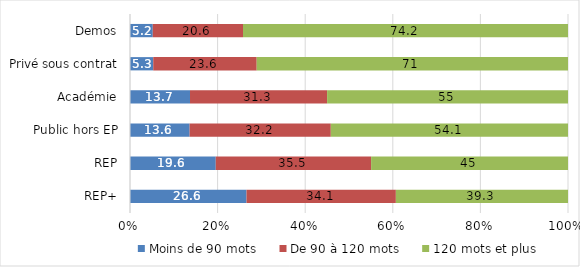
| Category | Moins de 90 mots | De 90 à 120 mots | 120 mots et plus |
|---|---|---|---|
| REP+ | 26.6 | 34.1 | 39.3 |
| REP | 19.6 | 35.5 | 45 |
| Public hors EP | 13.6 | 32.2 | 54.1 |
| Académie | 13.7 | 31.3 | 55 |
| Privé sous contrat | 5.3 | 23.6 | 71 |
| Demos | 5.2 | 20.6 | 74.2 |